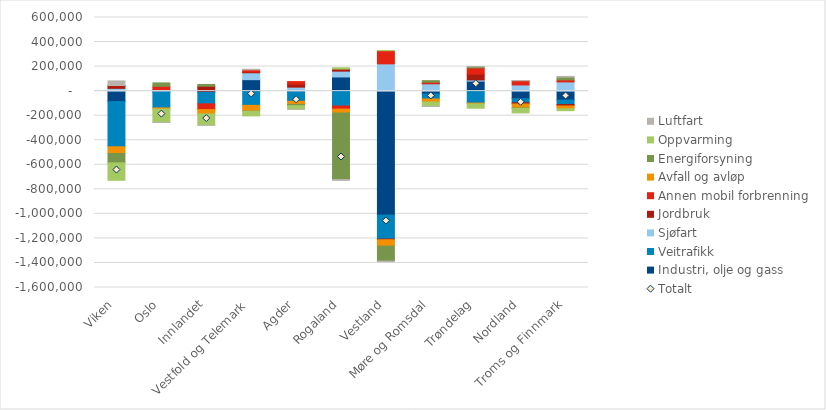
| Category | Industri, olje og gass | Veitrafikk | Sjøfart | Jordbruk | Annen mobil forbrenning | Avfall og avløp | Energiforsyning | Oppvarming | Luftfart |
|---|---|---|---|---|---|---|---|---|---|
| Viken | -85152.148 | -368093.054 | 22578.925 | 20515.113 | 2903.784 | -54944.48 | -76394.194 | -141860.873 | 37348.553 |
| Oslo | -7960.352 | -128725.162 | 11024.4 | 0 | 28561.969 | -9646.249 | 27607.812 | -108137.675 | -0.662 |
| Innlandet | -7841.126 | -95877.206 | 0 | 40166.938 | -46436.68 | -34838.73 | 14170.173 | -92718.5 | -201.055 |
| Vestfold og Telemark | 93576.523 | -115793.383 | 56007.018 | 6541.628 | 17345.904 | -47205.475 | -1072.391 | -37561.104 | 5051.154 |
| Agder | -10494.725 | -72178.991 | 32444.961 | 24215.056 | 21078.895 | -25269.042 | -10779.734 | -28967.695 | -52.614 |
| Rogaland | 115570.957 | -121085.139 | 47348.959 | 16925.385 | -25512.051 | -32001.844 | -541772 | 10820.282 | -6913.729 |
| Vestland | -1010387.72 | -195065.699 | 222412.706 | -5362.977 | 106966.508 | -52141.203 | -121800.867 | 1562.1 | -4321.611 |
| Møre og Romsdal | -23247.522 | -40218.435 | 60017.615 | 2008.654 | 11116.267 | -25386.423 | 12435.683 | -35536.508 | -234.214 |
| Trøndelag | 81417.645 | -97389.524 | 10125.259 | 47026.572 | 51047.018 | -7051.028 | 9007.983 | -34815.028 | 299.131 |
| Nordland | -61992.653 | -33102.748 | 50582.453 | -9559.272 | 34327.857 | -31984.812 | -3587.891 | -37025.132 | 1453.783 |
| Troms og Finnmark | -73561.12 | -35642.856 | 75207.203 | -11423.351 | 16506.465 | -23249.114 | 22076.185 | -15314.203 | 6103.706 |